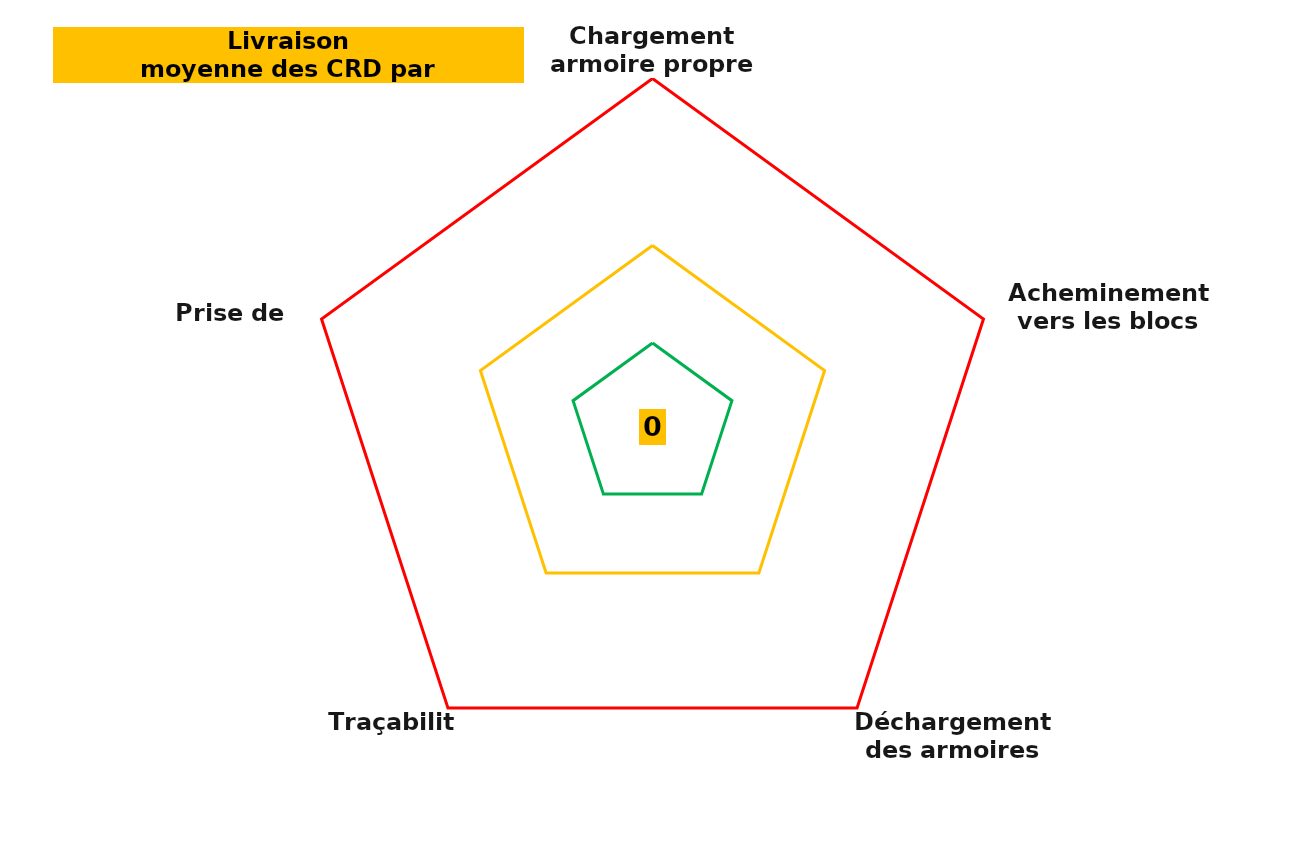
| Category | Series 0 | Series 1 | Series 2 | Series 3 |
|---|---|---|---|---|
| Chargement armoire propre | 0 | 6 | 13 | 25 |
| Acheminement vers les blocs | 0 | 6 | 13 | 25 |
| Déchargement des armoires propres | 0 | 6 | 13 | 25 |
| Traçabilité | 0 | 6 | 13 | 25 |
| Prise de poste | 0 | 6 | 13 | 25 |